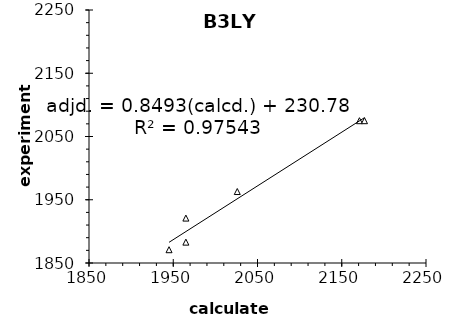
| Category | BP86 |
|---|---|
| 1945.0 | 1871 |
| 1965.0 | 1883 |
| 1965.0 | 1921 |
| 2026.0 | 1963 |
| 2171.0 | 2075 |
| 2177.0 | 2075 |